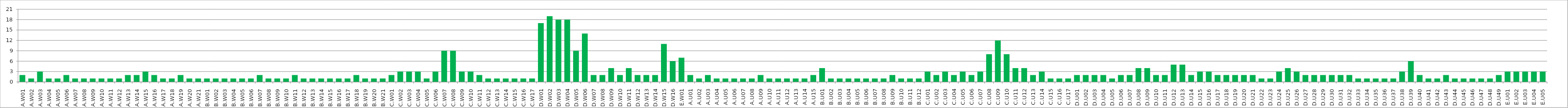
| Category | Series 0 |
|---|---|
| A.W01 | 2 |
| A.W02 | 1 |
| A.W03 | 3 |
| A.W04 | 1 |
| A.W05 | 1 |
| A.W06 | 2 |
| A.W07 | 1 |
| A.W08 | 1 |
| A.W09 | 1 |
| A.W10 | 1 |
| A.W11 | 1 |
| A.W12 | 1 |
| A.W13 | 2 |
| A.W14 | 2 |
| A.W15 | 3 |
| A.W16 | 2 |
| A.W17 | 1 |
| A.W18 | 1 |
| A.W19 | 2 |
| A.W20 | 1 |
| A.W21 | 1 |
| B.W01 | 1 |
| B.W02 | 1 |
| B.W03 | 1 |
| B.W04 | 1 |
| B.W05 | 1 |
| B.W06 | 1 |
| B.W07 | 2 |
| B.W08 | 1 |
| B.W09 | 1 |
| B.W10 | 1 |
| B.W11 | 2 |
| B.W12 | 1 |
| B.W13 | 1 |
| B.W14 | 1 |
| B.W15 | 1 |
| B.W16 | 1 |
| B.W17 | 1 |
| B.W18 | 2 |
| B.W19 | 1 |
| B.W20 | 1 |
| B.W21 | 1 |
| C.W01 | 2 |
| C.W02 | 3 |
| C.W03 | 3 |
| C.W04 | 3 |
| C.W05 | 1 |
| C.W06 | 3 |
| C.W07 | 9 |
| C.W08 | 9 |
| C.W09 | 3 |
| C.W10 | 3 |
| C.W11 | 2 |
| C.W12 | 1 |
| C.W13 | 1 |
| C.W14 | 1 |
| C.W15 | 1 |
| C.W16 | 1 |
| C.W17 | 1 |
| D.W01 | 17 |
| D.W02 | 19 |
| D.W03 | 18 |
| D.W04 | 18 |
| D.W05 | 9 |
| D.W06 | 14 |
| D.W07 | 2 |
| D.W08 | 2 |
| D.W09 | 4 |
| D.W10 | 2 |
| D.W11 | 4 |
| D.W12 | 2 |
| D.W13 | 2 |
| D.W14 | 2 |
| D.W15 | 11 |
| D.W16 | 6 |
| E.W01 | 7 |
| A.U01 | 2 |
| A.U02 | 1 |
| A.U03 | 2 |
| A.U04 | 1 |
| A.U05 | 1 |
| A.U06 | 1 |
| A.U07 | 1 |
| A.U08 | 1 |
| A.U09 | 2 |
| A.U10 | 1 |
| A.U11 | 1 |
| A.U12 | 1 |
| A.U13 | 1 |
| A.U14 | 1 |
| A.U15 | 2 |
| B.U01 | 4 |
| B.U02 | 1 |
| B.U03 | 1 |
| B.U04 | 1 |
| B.U05 | 1 |
| B.U06 | 1 |
| B.U07 | 1 |
| B.U08 | 1 |
| B.U09 | 2 |
| B.U10 | 1 |
| B.U11 | 1 |
| B.U12 | 1 |
| C.U01 | 3 |
| C.U02 | 2 |
| C.U03 | 3 |
| C.U04 | 2 |
| C.U05 | 3 |
| C.U06 | 2 |
| C.U07 | 3 |
| C.U08 | 8 |
| C.U09 | 12 |
| C.U10 | 8 |
| C.U11 | 4 |
| C.U12 | 4 |
| C.U13 | 2 |
| C.U14 | 3 |
| C.U15 | 1 |
| C.U16 | 1 |
| C.U17 | 1 |
| D.U01 | 2 |
| D.U02 | 2 |
| D.U03 | 2 |
| D.U04 | 2 |
| D.U05 | 1 |
| D.U06 | 2 |
| D.U07 | 2 |
| D.U08 | 4 |
| D.U09 | 4 |
| D.U10 | 2 |
| D.U11 | 2 |
| D.U12 | 5 |
| D.U13 | 5 |
| D.U14 | 2 |
| D.U15 | 3 |
| D.U16 | 3 |
| D.U17 | 2 |
| D.U18 | 2 |
| D.U19 | 2 |
| D.U20 | 2 |
| D.U21 | 2 |
| D.U22 | 1 |
| D.U23 | 1 |
| D.U24 | 3 |
| D.U25 | 4 |
| D.U26 | 3 |
| D.U27 | 2 |
| D.U28 | 2 |
| D.U29 | 2 |
| D.U30 | 2 |
| D.U31 | 2 |
| D.U32 | 2 |
| D.U33 | 1 |
| D.U34 | 1 |
| D.U35 | 1 |
| D.U36 | 1 |
| D.U37 | 1 |
| D.U38 | 3 |
| D.U39 | 6 |
| D.U40 | 2 |
| D.U41 | 1 |
| D.U42 | 1 |
| D.U43 | 2 |
| D.U44 | 1 |
| D.U45 | 1 |
| D.U46 | 1 |
| D.U47 | 1 |
| D.U48 | 1 |
| D.U49 | 2 |
| E.U01 | 3 |
| E.U02 | 3 |
| E.U03 | 3 |
| E.U04 | 3 |
| E.U05 | 3 |